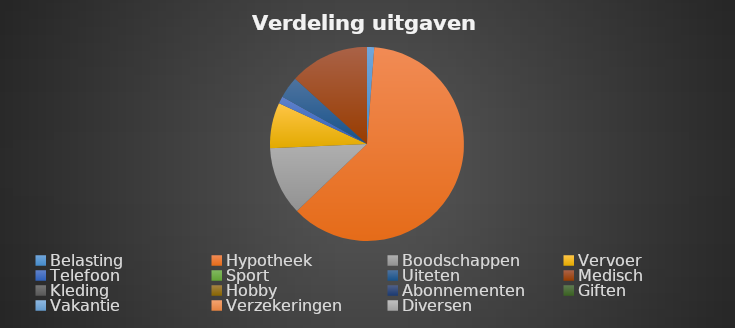
| Category | Series 0 |
|---|---|
| Belasting | 0.833 |
| Hypotheek | 42.583 |
| Boodschappen | 7.917 |
| Vervoer | 5.25 |
| Telefoon | 0.833 |
| Sport | 0 |
| Uiteten | 2.5 |
| Medisch | 9.167 |
| Kleding | 0 |
| Hobby | 0 |
| Abonnementen | 0 |
| Giften | 0 |
| Vakantie | 0 |
| Verzekeringen | 0 |
| Diversen | 0 |